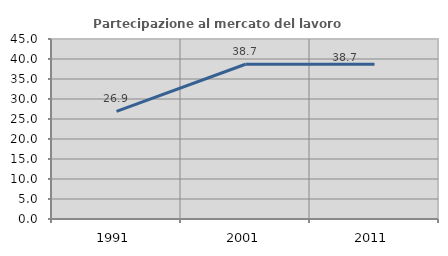
| Category | Partecipazione al mercato del lavoro  femminile |
|---|---|
| 1991.0 | 26.923 |
| 2001.0 | 38.69 |
| 2011.0 | 38.69 |